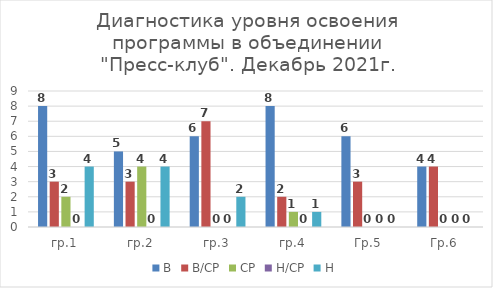
| Category | В | В/СР | СР | Н/СР | Н |
|---|---|---|---|---|---|
| гр.1 | 8 | 3 | 2 | 0 | 4 |
| гр.2 | 5 | 3 | 4 | 0 | 4 |
| гр.3 | 6 | 7 | 0 | 0 | 2 |
| гр.4 | 8 | 2 | 1 | 0 | 1 |
| Гр.5 | 6 | 3 | 0 | 0 | 0 |
| Гр.6 | 4 | 4 | 0 | 0 | 0 |